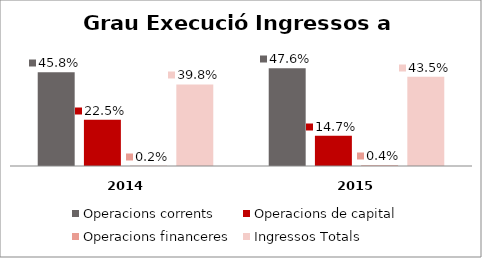
| Category | Operacions corrents | Operacions de capital | Operacions financeres | Ingressos Totals |
|---|---|---|---|---|
| 0 | 0.458 | 0.225 | 0.002 | 0.398 |
| 1 | 0.476 | 0.147 | 0.004 | 0.435 |